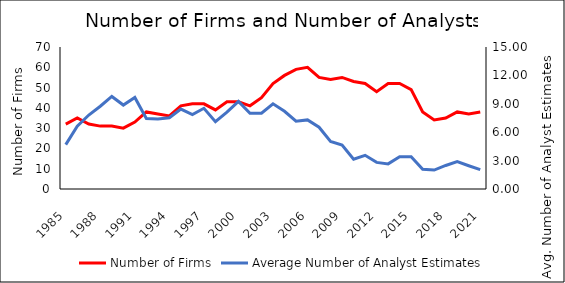
| Category | Number of Firms |
|---|---|
| 1985.0 | 32 |
| 1986.0 | 35 |
| 1987.0 | 32 |
| 1988.0 | 31 |
| 1989.0 | 31 |
| 1990.0 | 30 |
| 1991.0 | 33 |
| 1992.0 | 38 |
| 1993.0 | 37 |
| 1994.0 | 36 |
| 1995.0 | 41 |
| 1996.0 | 42 |
| 1997.0 | 42 |
| 1998.0 | 39 |
| 1999.0 | 43 |
| 2000.0 | 43 |
| 2001.0 | 41 |
| 2002.0 | 45 |
| 2003.0 | 52 |
| 2004.0 | 56 |
| 2005.0 | 59 |
| 2006.0 | 60 |
| 2007.0 | 55 |
| 2008.0 | 54 |
| 2009.0 | 55 |
| 2010.0 | 53 |
| 2011.0 | 52 |
| 2012.0 | 48 |
| 2013.0 | 52 |
| 2014.0 | 52 |
| 2015.0 | 49 |
| 2016.0 | 38 |
| 2017.0 | 34 |
| 2018.0 | 35 |
| 2019.0 | 38 |
| 2020.0 | 37 |
| 2021.0 | 38 |